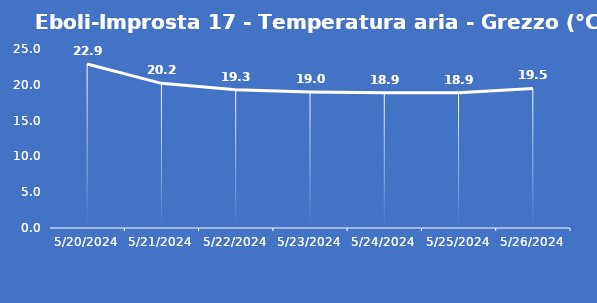
| Category | Eboli-Improsta 17 - Temperatura aria - Grezzo (°C) |
|---|---|
| 5/20/24 | 22.9 |
| 5/21/24 | 20.2 |
| 5/22/24 | 19.3 |
| 5/23/24 | 19 |
| 5/24/24 | 18.9 |
| 5/25/24 | 18.9 |
| 5/26/24 | 19.5 |